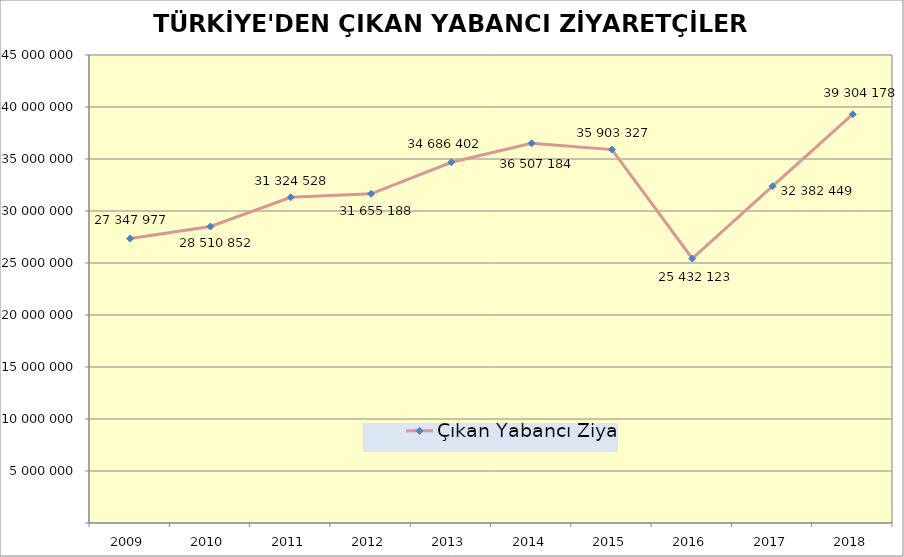
| Category | Çıkan Yabancı Ziyaretçi |
|---|---|
| 2009 | 27347977 |
| 2010 | 28510852 |
| 2011 | 31324528 |
| 2012 | 31655188 |
| 2013 | 34686402 |
| 2014 | 36507184 |
| 2015 | 35903327 |
| 2016 | 25432123 |
| 2017 | 32382449 |
| 2018 | 39304178 |